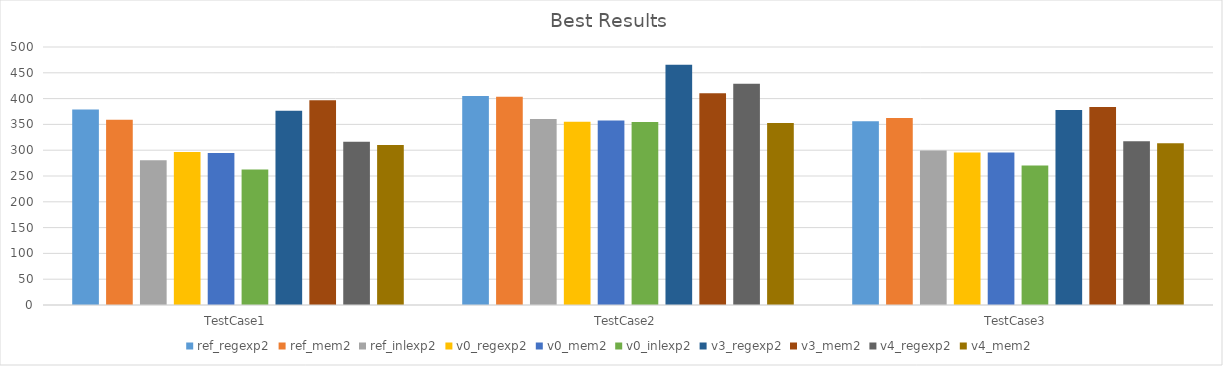
| Category | ref_regexp2 | ref_mem2 | ref_inlexp2 | v0_regexp2 | v0_mem2 | v0_inlexp2 | v3_regexp2 | v3_mem2 | v4_regexp2 | v4_mem2 |
|---|---|---|---|---|---|---|---|---|---|---|
| TestCase1 | 378.711 | 359.062 | 280.302 | 296.478 | 294.75 | 262.834 | 376.665 | 396.984 | 316.4 | 309.843 |
| TestCase2 | 405.141 | 403.426 | 360.279 | 355.169 | 357.557 | 354.584 | 465.402 | 410.462 | 428.899 | 352.72 |
| TestCase3 | 356.34 | 362.165 | 299.629 | 295.468 | 295.705 | 270.224 | 377.779 | 383.648 | 317.411 | 313.327 |